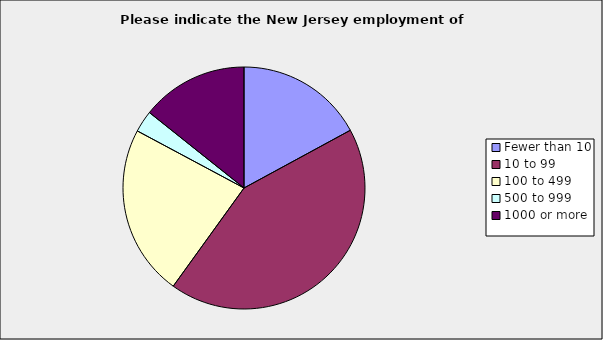
| Category | Series 0 |
|---|---|
| Fewer than 10 | 0.171 |
| 10 to 99 | 0.429 |
| 100 to 499 | 0.229 |
| 500 to 999 | 0.029 |
| 1000 or more | 0.143 |